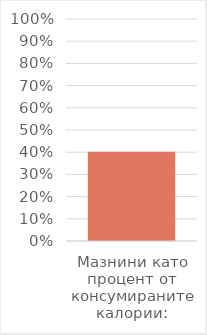
| Category | Series 0 |
|---|---|
| Мазнини като процент от консумираните калории: | 0.402 |